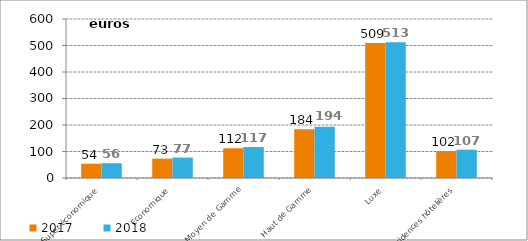
| Category | 2017 | 2018 |
|---|---|---|
| Super-économique | 53.989 | 55.744 |
| Economique | 73.13 | 77.053 |
| Moyen de Gamme | 112.386 | 116.859 |
| Haut de Gamme | 183.721 | 193.829 |
| Luxe | 509.03 | 512.524 |
| Résidences hôtelières | 101.685 | 106.944 |